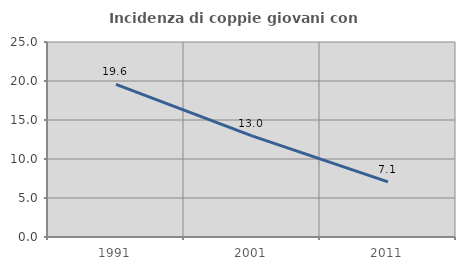
| Category | Incidenza di coppie giovani con figli |
|---|---|
| 1991.0 | 19.561 |
| 2001.0 | 12.969 |
| 2011.0 | 7.069 |